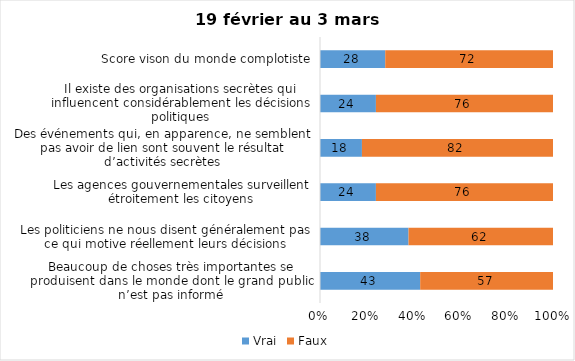
| Category | Vrai | Faux |
|---|---|---|
| Beaucoup de choses très importantes se produisent dans le monde dont le grand public n’est pas informé | 43 | 57 |
| Les politiciens ne nous disent généralement pas ce qui motive réellement leurs décisions | 38 | 62 |
| Les agences gouvernementales surveillent étroitement les citoyens | 24 | 76 |
| Des événements qui, en apparence, ne semblent pas avoir de lien sont souvent le résultat d’activités secrètes | 18 | 82 |
| Il existe des organisations secrètes qui influencent considérablement les décisions politiques | 24 | 76 |
| Score vison du monde complotiste | 28 | 72 |